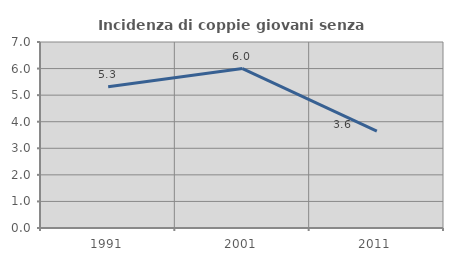
| Category | Incidenza di coppie giovani senza figli |
|---|---|
| 1991.0 | 5.319 |
| 2001.0 | 6.001 |
| 2011.0 | 3.647 |